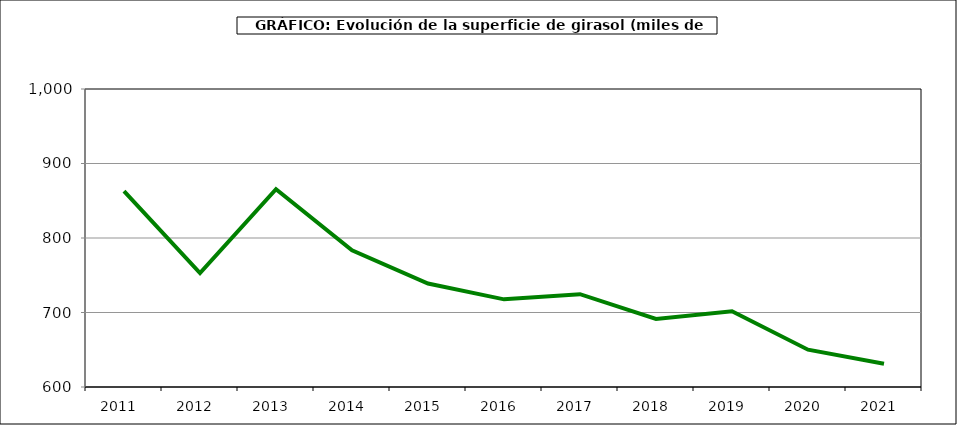
| Category | Superficie |
|---|---|
| 2011.0 | 862.869 |
| 2012.0 | 753.015 |
| 2013.0 | 865.564 |
| 2014.0 | 783.425 |
| 2015.0 | 738.851 |
| 2016.0 | 717.672 |
| 2017.0 | 724.629 |
| 2018.0 | 691.276 |
| 2019.0 | 701.768 |
| 2020.0 | 650.054 |
| 2021.0 | 631.157 |